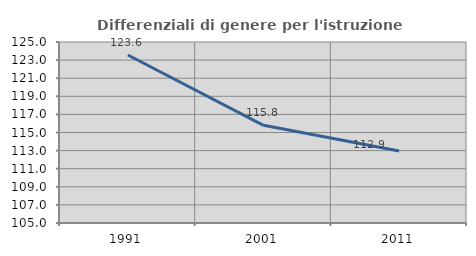
| Category | Differenziali di genere per l'istruzione superiore |
|---|---|
| 1991.0 | 123.561 |
| 2001.0 | 115.795 |
| 2011.0 | 112.945 |